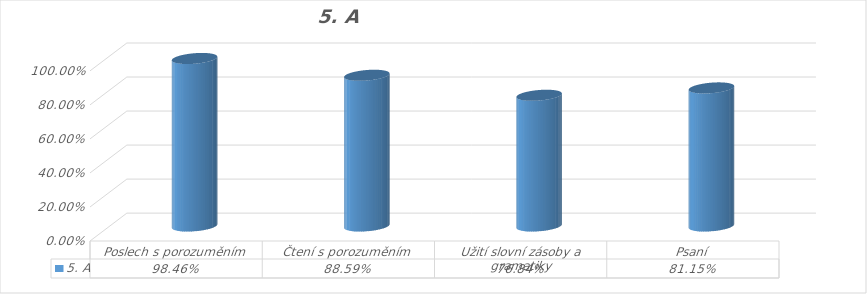
| Category | 5. A |
|---|---|
| Poslech s porozuměním | 0.985 |
| Čtení s porozuměním | 0.886 |
| Užití slovní zásoby a gramatiky | 0.768 |
| Psaní | 0.812 |